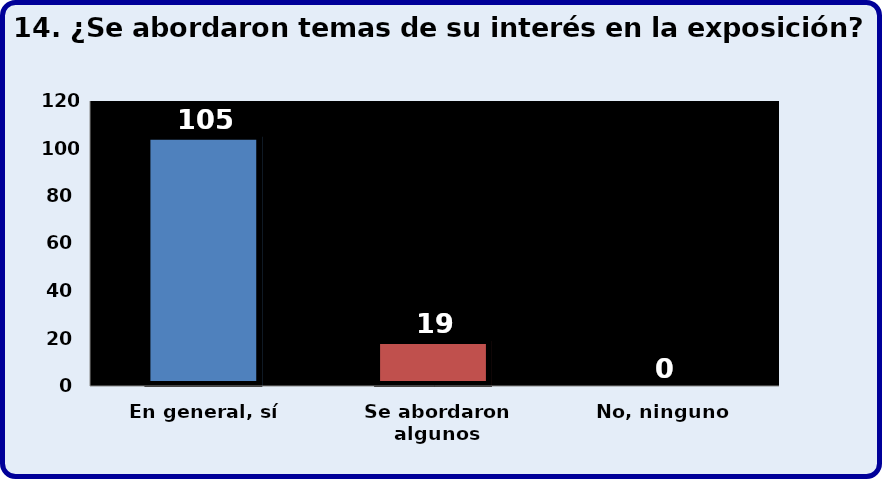
| Category | Series 0 |
|---|---|
| En general, sí | 105 |
| Se abordaron algunos | 19 |
| No, ninguno | 0 |